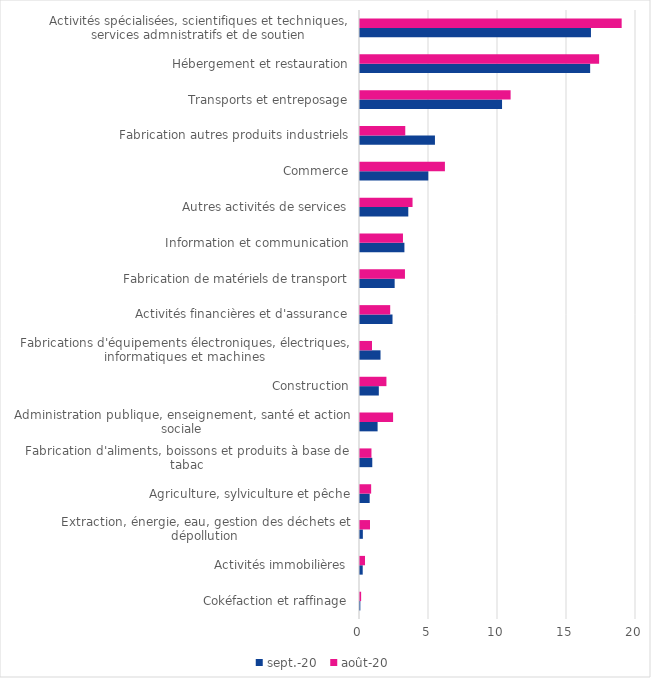
| Category | sept.-20 | août-20 |
|---|---|---|
| Cokéfaction et raffinage | 0.024 | 0.082 |
| Activités immobilières | 0.196 | 0.365 |
| Extraction, énergie, eau, gestion des déchets et dépollution | 0.207 | 0.727 |
| Agriculture, sylviculture et pêche | 0.701 | 0.808 |
| Fabrication d'aliments, boissons et produits à base de tabac | 0.89 | 0.831 |
| Administration publique, enseignement, santé et action sociale | 1.275 | 2.398 |
| Construction | 1.364 | 1.916 |
| Fabrications d'équipements électroniques, électriques, informatiques et machines | 1.487 | 0.869 |
| Activités financières et d'assurance | 2.356 | 2.189 |
| Fabrication de matériels de transport | 2.511 | 3.257 |
| Information et communication | 3.219 | 3.114 |
| Autres activités de services | 3.499 | 3.808 |
| Commerce | 4.949 | 6.154 |
| Fabrication autres produits industriels | 5.431 | 3.28 |
| Transports et entreposage | 10.294 | 10.914 |
| Hébergement et restauration | 16.677 | 17.328 |
| Activités spécialisées, scientifiques et techniques, services admnistratifs et de soutien | 16.737 | 18.961 |